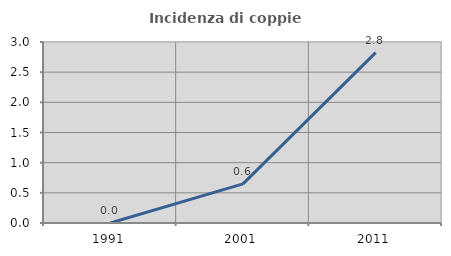
| Category | Incidenza di coppie miste |
|---|---|
| 1991.0 | 0 |
| 2001.0 | 0.649 |
| 2011.0 | 2.825 |